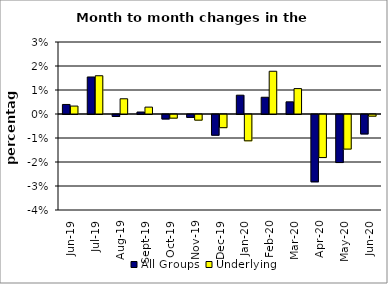
| Category | All Groups | Underlying |
|---|---|---|
| 2019-06-01 | 0.004 | 0.003 |
| 2019-07-01 | 0.015 | 0.016 |
| 2019-08-01 | -0.001 | 0.006 |
| 2019-09-01 | 0.001 | 0.003 |
| 2019-10-01 | -0.002 | -0.002 |
| 2019-11-01 | -0.001 | -0.002 |
| 2019-12-01 | -0.009 | -0.005 |
| 2020-01-01 | 0.008 | -0.011 |
| 2020-02-01 | 0.007 | 0.018 |
| 2020-03-01 | 0.005 | 0.011 |
| 2020-04-01 | -0.028 | -0.018 |
| 2020-05-01 | -0.02 | -0.014 |
| 2020-06-01 | -0.008 | -0.001 |